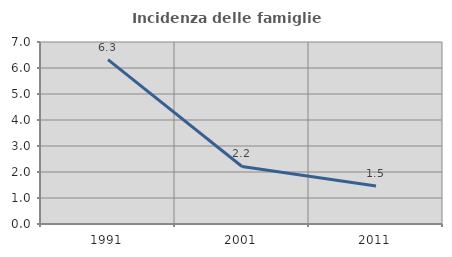
| Category | Incidenza delle famiglie numerose |
|---|---|
| 1991.0 | 6.32 |
| 2001.0 | 2.212 |
| 2011.0 | 1.459 |